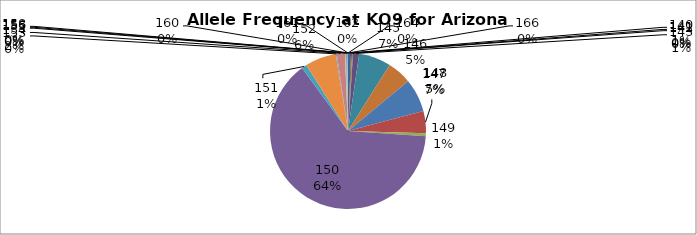
| Category | Series 0 |
|---|---|
| 140.0 | 0.006 |
| 141.0 | 0.002 |
| 142.0 | 0.002 |
| 143.0 | 0.013 |
| 145.0 | 0.067 |
| 146.0 | 0.05 |
| 147.0 | 0.069 |
| 148.0 | 0.046 |
| 149.0 | 0.006 |
| 150.0 | 0.639 |
| 151.0 | 0.01 |
| 152.0 | 0.065 |
| 153.0 | 0.002 |
| 154.0 | 0.017 |
| 155.0 | 0.002 |
| 156.0 | 0.002 |
| 158.0 | 0.002 |
| 160.0 | 0 |
| 161.0 | 0 |
| 162.0 | 0 |
| 164.0 | 0 |
| 166.0 | 0 |